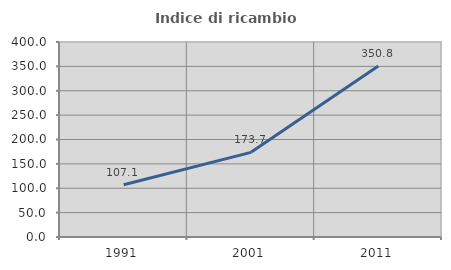
| Category | Indice di ricambio occupazionale  |
|---|---|
| 1991.0 | 107.094 |
| 2001.0 | 173.675 |
| 2011.0 | 350.751 |